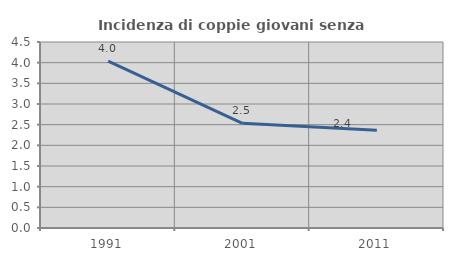
| Category | Incidenza di coppie giovani senza figli |
|---|---|
| 1991.0 | 4.039 |
| 2001.0 | 2.532 |
| 2011.0 | 2.365 |